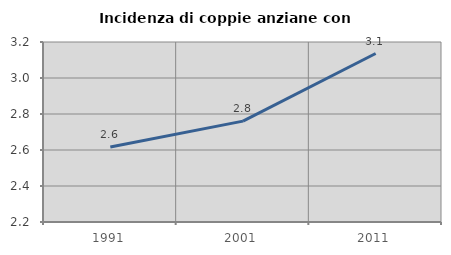
| Category | Incidenza di coppie anziane con figli |
|---|---|
| 1991.0 | 2.617 |
| 2001.0 | 2.76 |
| 2011.0 | 3.136 |